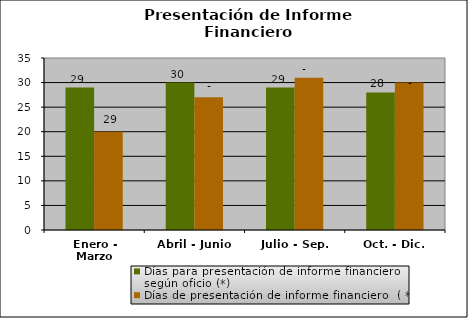
| Category | Días para presentación de informe financiero según oficio (*) | Días de presentación de informe financiero  ( ** ) |
|---|---|---|
| Enero - Marzo | 29 | 20 |
| Abril - Junio | 30 | 27 |
| Julio - Sep. | 29 | 31 |
| Oct. - Dic. | 28 | 30 |